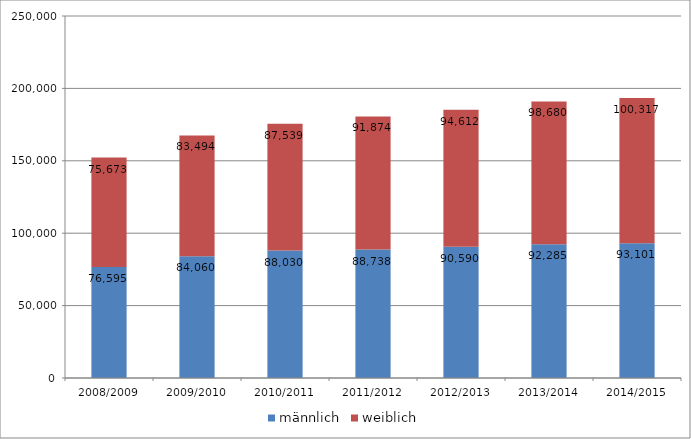
| Category | männlich | weiblich |
|---|---|---|
| 2008/2009 | 76595 | 75673 |
| 2009/2010 | 84060 | 83494 |
| 2010/2011 | 88030 | 87539 |
| 2011/2012 | 88738 | 91874 |
| 2012/2013 | 90590 | 94612 |
| 2013/2014 | 92285 | 98680 |
| 2014/2015 | 93101 | 100317 |